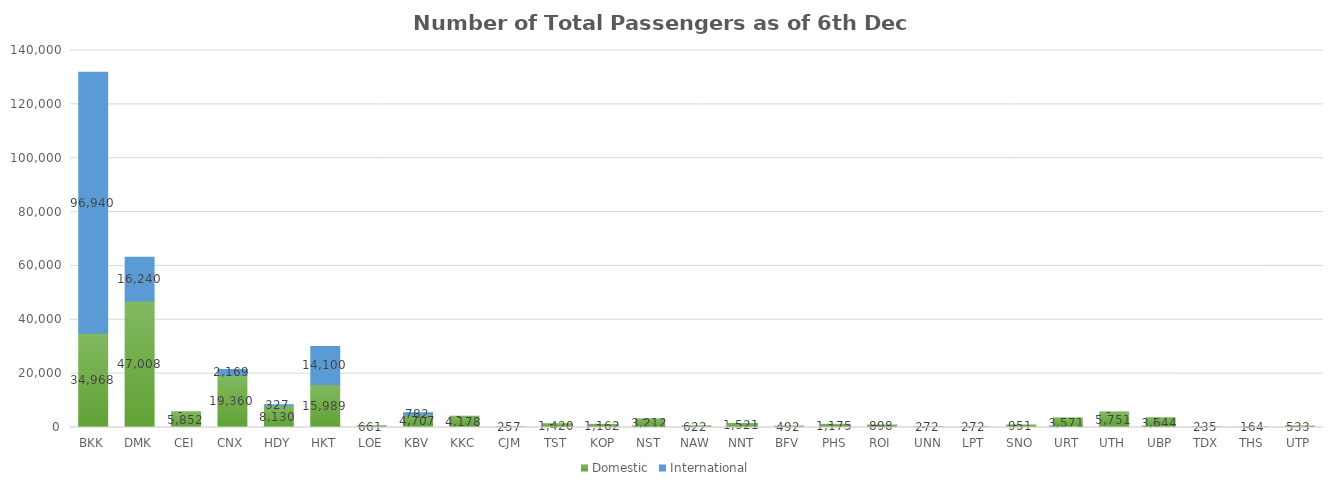
| Category | Domestic | International |
|---|---|---|
| BKK | 34968 | 96940 |
| DMK | 47008 | 16240 |
| CEI | 5852 | 0 |
| CNX | 19360 | 2169 |
| HDY | 8130 | 327 |
| HKT | 15989 | 14100 |
| LOE | 661 | 0 |
| KBV | 4707 | 782 |
| KKC | 4178 | 0 |
| CJM | 257 | 0 |
| TST | 1420 | 0 |
| KOP | 1162 | 0 |
| NST | 3212 | 0 |
| NAW | 622 | 0 |
| NNT | 1521 | 0 |
| BFV | 492 | 0 |
| PHS | 1175 | 0 |
| ROI | 898 | 0 |
| UNN | 272 | 0 |
| LPT | 272 | 0 |
| SNO | 951 | 0 |
| URT | 3571 | 0 |
| UTH | 5751 | 0 |
| UBP | 3644 | 0 |
| TDX | 235 | 0 |
| THS | 164 | 0 |
| UTP | 533 | 0 |